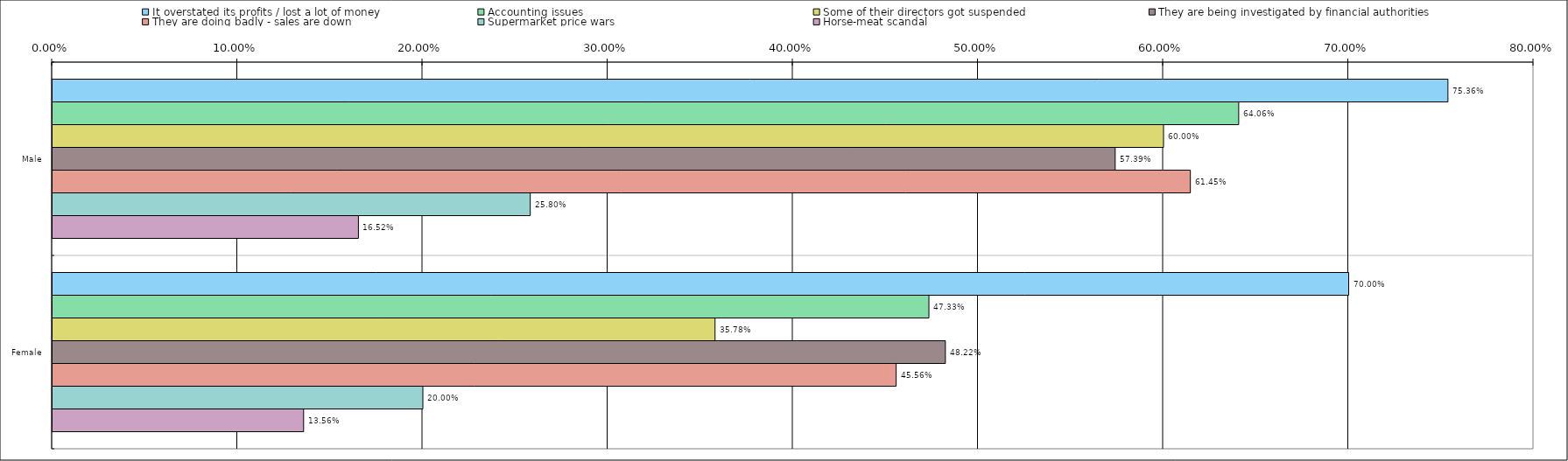
| Category | It overstated its profits / lost a lot of money | Accounting issues | Some of their directors got suspended | They are being investigated by financial authorities | They are doing badly - sales are down | Supermarket price wars | Horse-meat scandal |
|---|---|---|---|---|---|---|---|
| 0 | 0.754 | 0.641 | 0.6 | 0.574 | 0.614 | 0.258 | 0.165 |
| 1 | 0.7 | 0.473 | 0.358 | 0.482 | 0.456 | 0.2 | 0.136 |